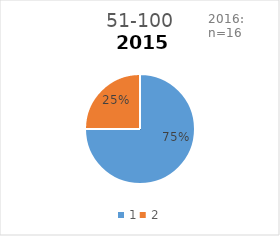
| Category | 51-100 |
|---|---|
| 0 | 0.75 |
| 1 | 0.25 |